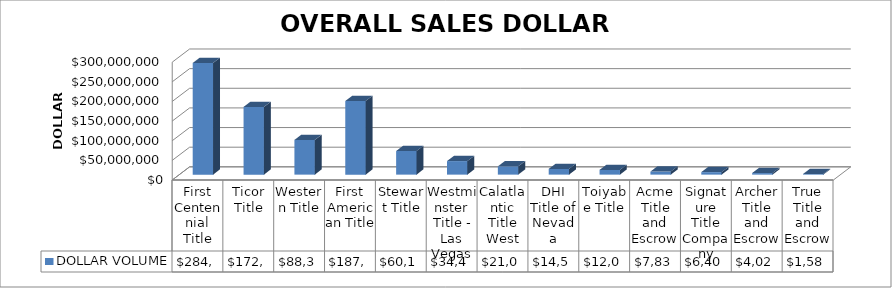
| Category | DOLLAR VOLUME |
|---|---|
| First Centennial Title | 284257389.5 |
| Ticor Title | 172454349.11 |
| Western Title | 88350077 |
| First American Title | 187467688 |
| Stewart Title | 60121950 |
| Westminster Title - Las Vegas | 34487525 |
| Calatlantic Title West | 21070884 |
| DHI Title of Nevada | 14500881.21 |
| Toiyabe Title | 12051900 |
| Acme Title and Escrow | 7832500 |
| Signature Title Company | 6408770 |
| Archer Title and Escrow | 4026000 |
| True Title and Escrow | 1587000 |